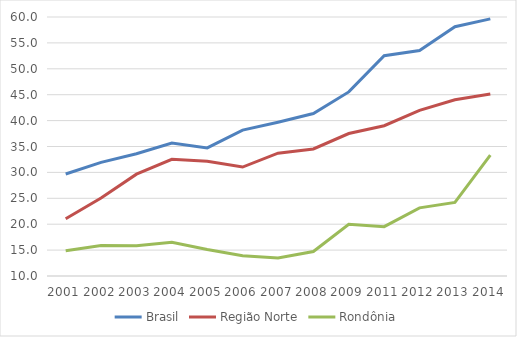
| Category | Brasil | Região Norte | Rondônia |
|---|---|---|---|
| 2001.0 | 29.688 | 21.054 | 14.869 |
| 2002.0 | 31.93 | 25.043 | 15.893 |
| 2003.0 | 33.607 | 29.661 | 15.858 |
| 2004.0 | 35.677 | 32.53 | 16.507 |
| 2005.0 | 34.718 | 32.17 | 15.123 |
| 2006.0 | 38.163 | 31.034 | 13.903 |
| 2007.0 | 39.695 | 33.709 | 13.467 |
| 2008.0 | 41.365 | 34.518 | 14.731 |
| 2009.0 | 45.537 | 37.501 | 19.988 |
| 2011.0 | 52.531 | 39.009 | 19.526 |
| 2012.0 | 53.525 | 41.987 | 23.154 |
| 2013.0 | 58.121 | 44.035 | 24.194 |
| 2014.0 | 59.64 | 45.121 | 33.353 |